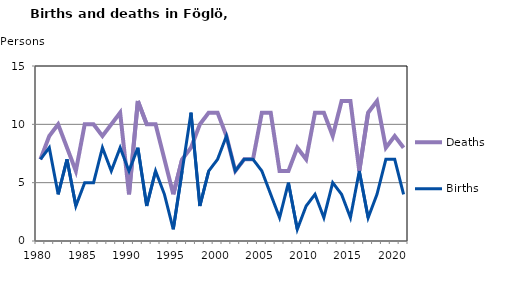
| Category | Deaths | Births |
|---|---|---|
| 1980.0 | 7 | 7 |
| 1981.0 | 9 | 8 |
| 1982.0 | 10 | 4 |
| 1983.0 | 8 | 7 |
| 1984.0 | 6 | 3 |
| 1985.0 | 10 | 5 |
| 1986.0 | 10 | 5 |
| 1987.0 | 9 | 8 |
| 1988.0 | 10 | 6 |
| 1989.0 | 11 | 8 |
| 1990.0 | 4 | 6 |
| 1991.0 | 12 | 8 |
| 1992.0 | 10 | 3 |
| 1993.0 | 10 | 6 |
| 1994.0 | 7 | 4 |
| 1995.0 | 4 | 1 |
| 1996.0 | 7 | 6 |
| 1997.0 | 8 | 11 |
| 1998.0 | 10 | 3 |
| 1999.0 | 11 | 6 |
| 2000.0 | 11 | 7 |
| 2001.0 | 9 | 9 |
| 2002.0 | 6 | 6 |
| 2003.0 | 7 | 7 |
| 2004.0 | 7 | 7 |
| 2005.0 | 11 | 6 |
| 2006.0 | 11 | 4 |
| 2007.0 | 6 | 2 |
| 2008.0 | 6 | 5 |
| 2009.0 | 8 | 1 |
| 2010.0 | 7 | 3 |
| 2011.0 | 11 | 4 |
| 2012.0 | 11 | 2 |
| 2013.0 | 9 | 5 |
| 2014.0 | 12 | 4 |
| 2015.0 | 12 | 2 |
| 2016.0 | 6 | 6 |
| 2017.0 | 11 | 2 |
| 2018.0 | 12 | 4 |
| 2019.0 | 8 | 7 |
| 2020.0 | 9 | 7 |
| 2021.0 | 8 | 4 |